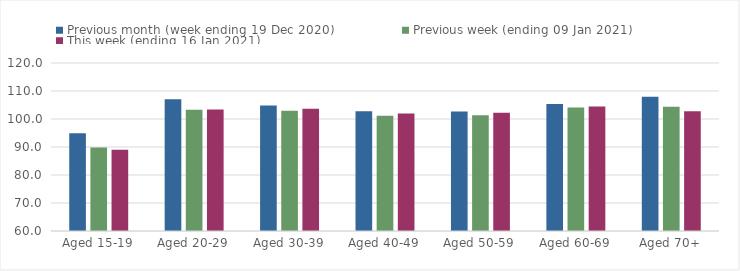
| Category | Previous month (week ending 19 Dec 2020) | Previous week (ending 09 Jan 2021) | This week (ending 16 Jan 2021) |
|---|---|---|---|
| Aged 15-19 | 94.94 | 89.8 | 89.06 |
| Aged 20-29 | 107.07 | 103.28 | 103.4 |
| Aged 30-39 | 104.8 | 102.93 | 103.67 |
| Aged 40-49 | 102.8 | 101.2 | 101.95 |
| Aged 50-59 | 102.66 | 101.38 | 102.19 |
| Aged 60-69 | 105.37 | 104.07 | 104.44 |
| Aged 70+ | 107.93 | 104.36 | 102.76 |